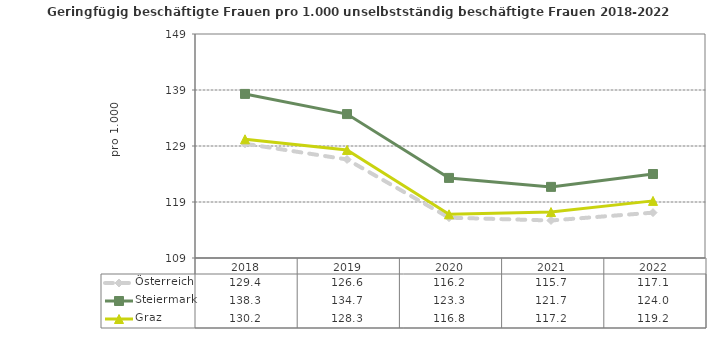
| Category | Österreich | Steiermark | Graz |
|---|---|---|---|
| 2022.0 | 117.1 | 124 | 119.2 |
| 2021.0 | 115.7 | 121.7 | 117.2 |
| 2020.0 | 116.2 | 123.3 | 116.8 |
| 2019.0 | 126.6 | 134.7 | 128.3 |
| 2018.0 | 129.4 | 138.3 | 130.2 |